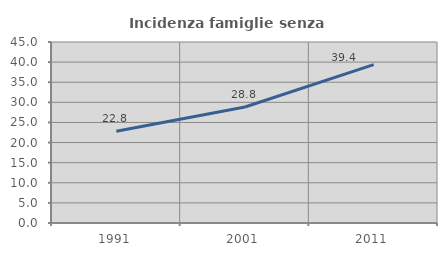
| Category | Incidenza famiglie senza nuclei |
|---|---|
| 1991.0 | 22.807 |
| 2001.0 | 28.843 |
| 2011.0 | 39.381 |